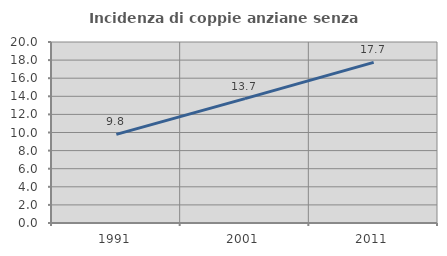
| Category | Incidenza di coppie anziane senza figli  |
|---|---|
| 1991.0 | 9.793 |
| 2001.0 | 13.748 |
| 2011.0 | 17.748 |